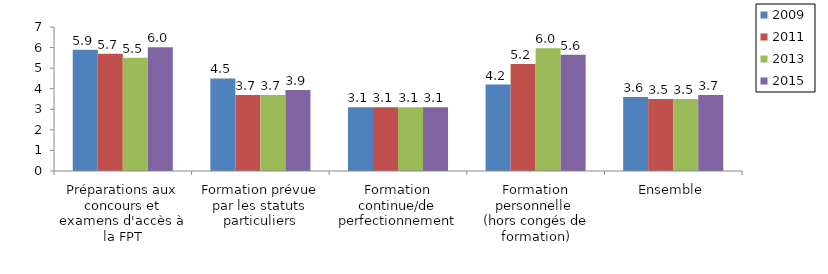
| Category | 2009 | 2011 | 2013 | 2015 |
|---|---|---|---|---|
| Préparations aux concours et examens d'accès à la FPT | 5.9 | 5.7 | 5.5 | 6.016 |
| Formation prévue par les statuts particuliers | 4.5 | 3.7 | 3.7 | 3.944 |
| Formation continue/de perfectionnement | 3.1 | 3.1 | 3.1 | 3.102 |
| Formation personnelle 
(hors congés de formation) | 4.2 | 5.2 | 5.968 | 5.648 |
| Ensemble | 3.6 | 3.5 | 3.5 | 3.698 |